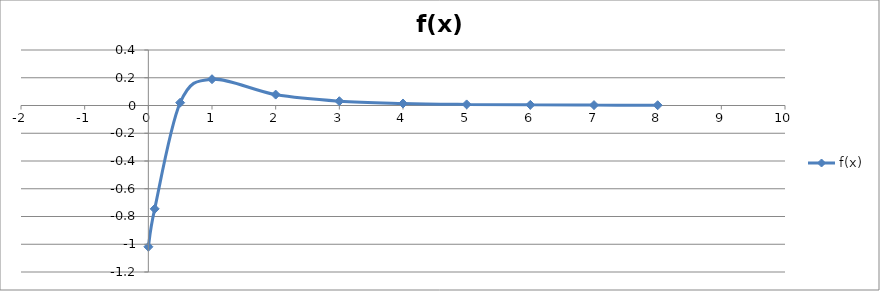
| Category | f(x) |
|---|---|
| 0.001 | -1.018 |
| 0.1 | -0.745 |
| 0.5 | 0.02 |
| 1.0 | 0.189 |
| 2.0 | 0.079 |
| 3.0 | 0.031 |
| 4.0 | 0.014 |
| 5.0 | 0.008 |
| 6.0 | 0.005 |
| 7.0 | 0.003 |
| 8.0 | 0.002 |